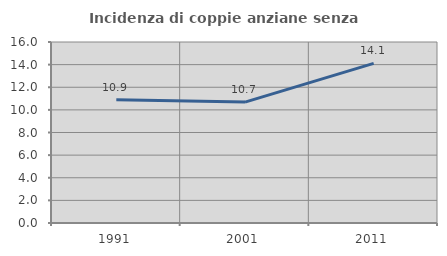
| Category | Incidenza di coppie anziane senza figli  |
|---|---|
| 1991.0 | 10.9 |
| 2001.0 | 10.686 |
| 2011.0 | 14.106 |